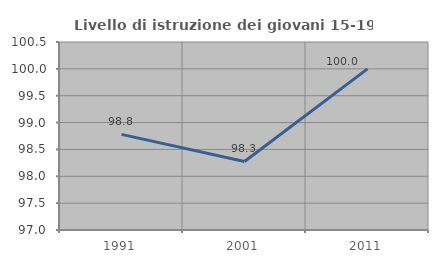
| Category | Livello di istruzione dei giovani 15-19 anni |
|---|---|
| 1991.0 | 98.78 |
| 2001.0 | 98.276 |
| 2011.0 | 100 |